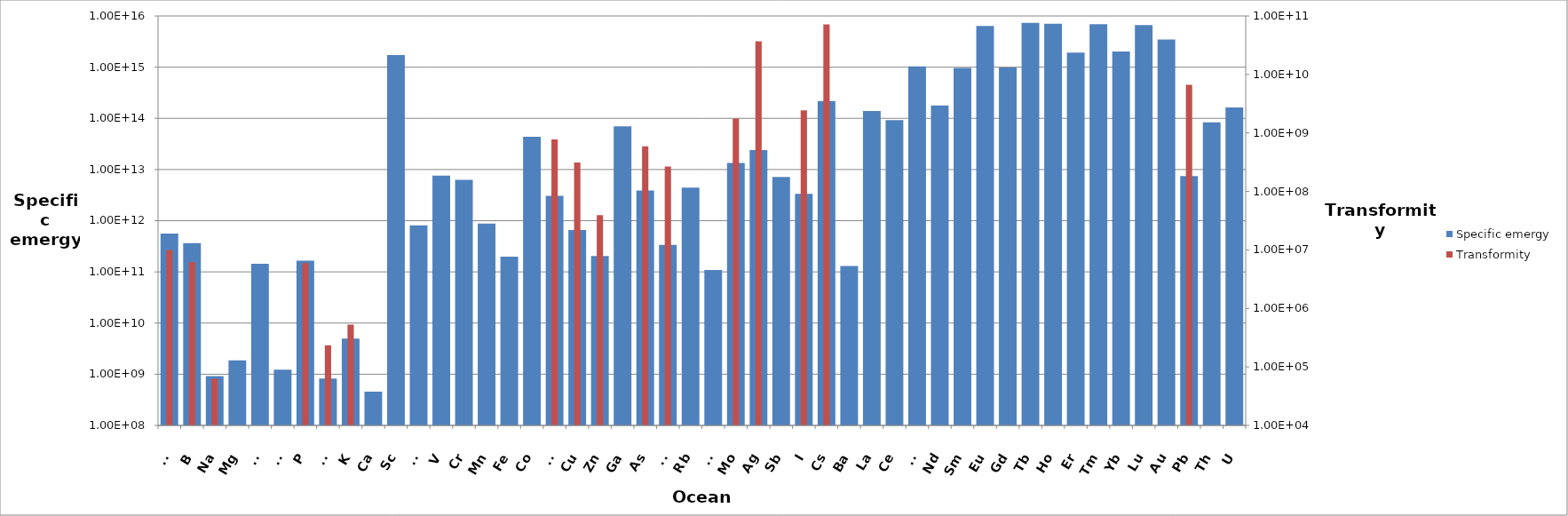
| Category | Specific emergy |
|---|---|
| Li | 562663022852.438 |
| B | 362822523612.49 |
| Na | 922473357.691 |
| Mg | 1866432551.665 |
| Al | 143652835915.278 |
| Si | 1232196898.834 |
| P | 165806549881.793 |
| Cl | 819678707.207 |
| K | 4956697595.865 |
| Ca | 456159496.131 |
| Sc | 1724342741330086.5 |
| Ti | 809517333385.142 |
| V | 7608666788861.857 |
| Cr | 6307535330340.305 |
| Mn | 881896181206.101 |
| Fe | 198295291075.774 |
| Co | 43845902278603.15 |
| Ni | 3066207245042.038 |
| Cu | 658100674199.422 |
| Zn | 204060250946.3 |
| Ga | 69491698799628.19 |
| As | 3880024911622.344 |
| Br | 335606441448.866 |
| Rb | 4413259886642.414 |
| Sr | 109224992102.487 |
| Mo | 13466642318977.357 |
| Ag | 23955012869112.016 |
| Sb | 7162981710520.033 |
| I | 3352284917399.7 |
| Cs | 218725912808851.9 |
| Ba | 129792768323.348 |
| La | 139517695140888.88 |
| Ce | 92205942341042.48 |
| Pr | 1031515862898503.5 |
| Nd | 179144434842302.72 |
| Sm | 966672234698738.4 |
| Eu | 6376627060160669 |
| Gd | 985938058441478.4 |
| Tb | 7341197958706494 |
| Ho | 7050207346598063 |
| Er | 1931109745430299 |
| Tm | 6883106406492586 |
| Yb | 2015933941876592.5 |
| Lu | 6645771475046256 |
| Au | 3452327344395353 |
| Pb | 7482565622100.506 |
| Th | 83520134466080.16 |
| U | 162835998649242.8 |